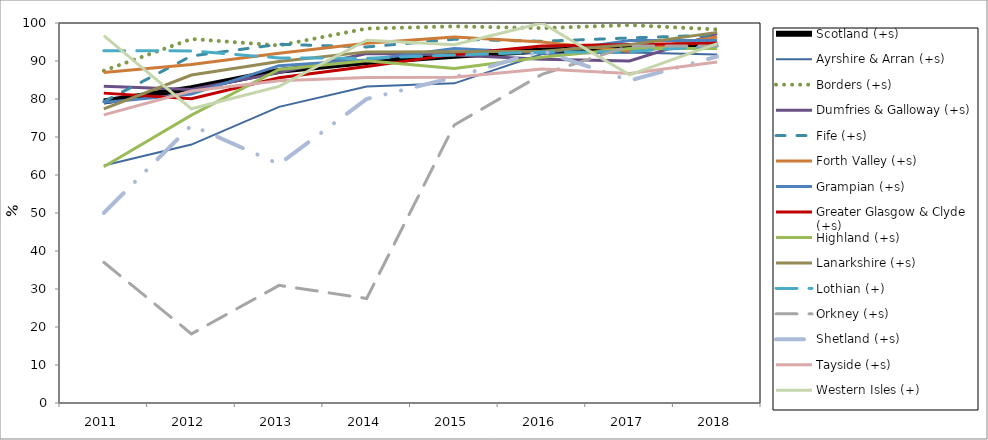
| Category | Scotland (+s) | Ayrshire & Arran (+s) | Borders (+s) | Dumfries & Galloway (+s) | Fife (+s) | Forth Valley (+s) | Grampian (+s) | Greater Glasgow & Clyde (+s) | Highland (+s) | Lanarkshire (+s) | Lothian (+) | Orkney (+s) | Shetland (+s) | Tayside (+s) | Western Isles (+) |
|---|---|---|---|---|---|---|---|---|---|---|---|---|---|---|---|
| 2011.0 | 79.339 | 62.5 | 87.446 | 83.333 | 79.292 | 86.949 | 79.062 | 81.546 | 62.178 | 77.402 | 92.726 | 37.037 | 50 | 75.829 | 96.667 |
| 2012.0 | 82.839 | 68.006 | 95.794 | 82.492 | 91.32 | 89.076 | 81.3 | 80.098 | 75.764 | 86.298 | 92.647 | 18.182 | 73.077 | 82.104 | 77.419 |
| 2013.0 | 87.407 | 77.939 | 94.091 | 86.942 | 94.399 | 92.017 | 88.776 | 85.568 | 87.764 | 89.878 | 90.809 | 30.952 | 62.857 | 84.812 | 83.333 |
| 2014.0 | 89.726 | 83.281 | 98.544 | 91.986 | 93.7 | 94.643 | 90.264 | 88.533 | 90.084 | 92.4 | 90.711 | 27.5 | 80 | 85.665 | 95.455 |
| 2015.0 | 91.379 | 84.122 | 99.111 | 91.549 | 95.721 | 96.317 | 93.277 | 91.741 | 88 | 92.445 | 91.574 | 73.171 | 85.714 | 85.714 | 94.286 |
| 2016.0 | 92.75 | 91.825 | 98.655 | 90.456 | 95.188 | 95.01 | 92.118 | 93.947 | 91.006 | 92.539 | 92.324 | 86.486 | 92.683 | 87.887 | 100 |
| 2017.0 | 93.213 | 92.208 | 99.451 | 90 | 96.066 | 92.578 | 95.419 | 94.328 | 93.261 | 94.256 | 92.476 | 93.939 | 84.848 | 86.704 | 86.364 |
| 2018.0 | 94.583 | 91.707 | 98.315 | 97.189 | 96.847 | 96.289 | 95.398 | 94.659 | 93.269 | 97.531 | 93.983 | 93.939 | 91.176 | 89.757 | 94.595 |